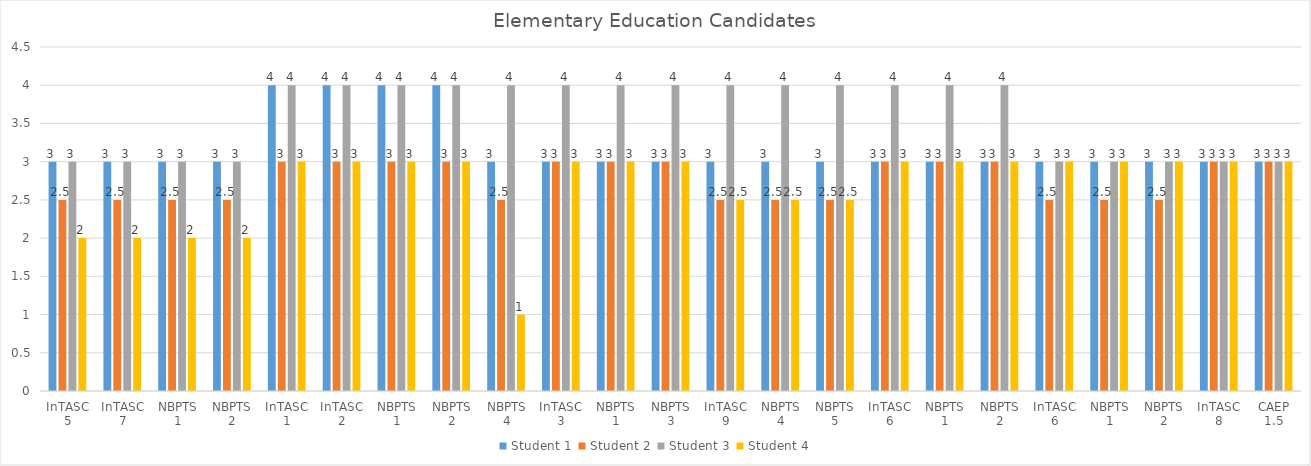
| Category | Student 1 | Student 2 | Student 3 | Student 4 |
|---|---|---|---|---|
| InTASC 5 | 3 | 2.5 | 3 | 2 |
| InTASC 7 | 3 | 2.5 | 3 | 2 |
| NBPTS 1 | 3 | 2.5 | 3 | 2 |
| NBPTS 2 | 3 | 2.5 | 3 | 2 |
| InTASC 1 | 4 | 3 | 4 | 3 |
| InTASC 2 | 4 | 3 | 4 | 3 |
| NBPTS 1 | 4 | 3 | 4 | 3 |
| NBPTS 2 | 4 | 3 | 4 | 3 |
| NBPTS 4 | 3 | 2.5 | 4 | 1 |
| InTASC 3 | 3 | 3 | 4 | 3 |
| NBPTS 1 | 3 | 3 | 4 | 3 |
| NBPTS 3 | 3 | 3 | 4 | 3 |
| InTASC 9 | 3 | 2.5 | 4 | 2.5 |
| NBPTS 4 | 3 | 2.5 | 4 | 2.5 |
| NBPTS 5 | 3 | 2.5 | 4 | 2.5 |
| InTASC 6 | 3 | 3 | 4 | 3 |
| NBPTS 1 | 3 | 3 | 4 | 3 |
| NBPTS 2 | 3 | 3 | 4 | 3 |
| InTASC 6 | 3 | 2.5 | 3 | 3 |
| NBPTS 1 | 3 | 2.5 | 3 | 3 |
| NBPTS 2 | 3 | 2.5 | 3 | 3 |
| InTASC 8 | 3 | 3 | 3 | 3 |
| CAEP 1.5 | 3 | 3 | 3 | 3 |